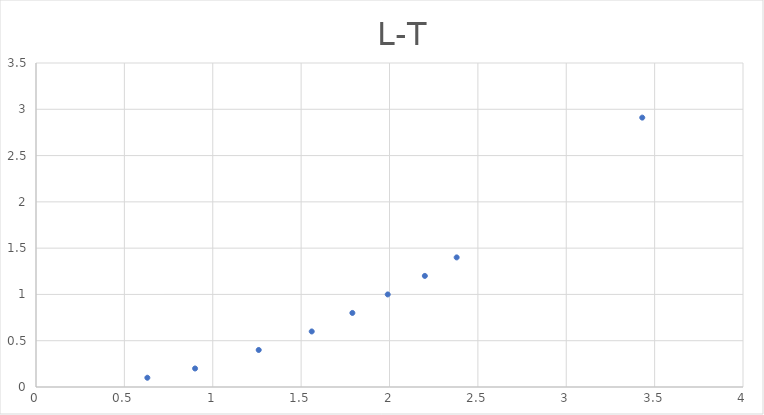
| Category | Series 0 |
|---|---|
| 0.63 | 0.1 |
| 0.9 | 0.2 |
| 1.26 | 0.4 |
| 1.56 | 0.6 |
| 1.79 | 0.8 |
| 1.99 | 1 |
| 2.2 | 1.2 |
| 2.38 | 1.4 |
| 3.43 | 2.91 |